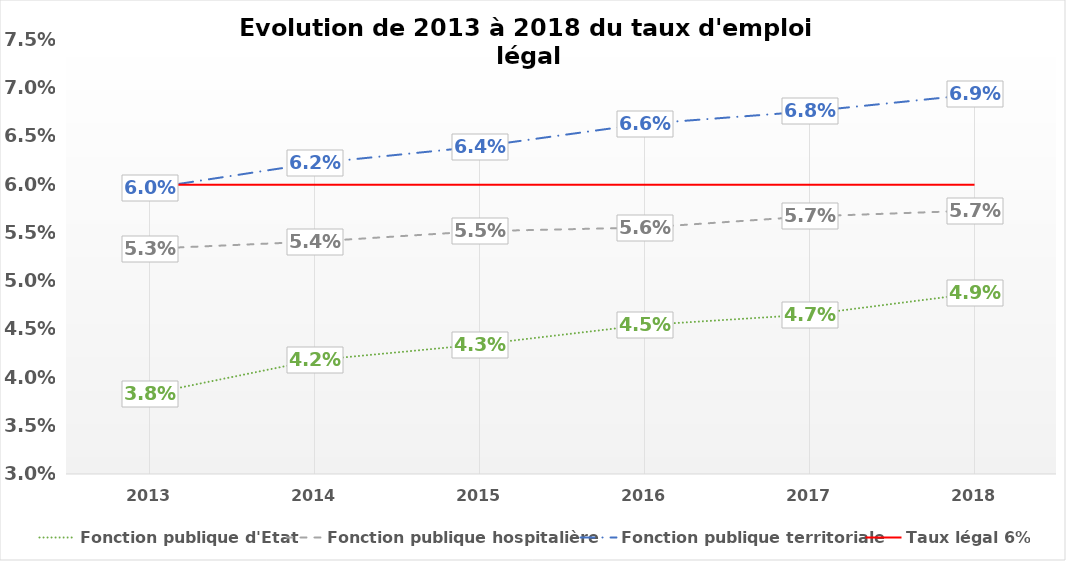
| Category | Fonction publique d'Etat | Fonction publique hospitalière | Fonction publique territoriale | Taux légal 6% |
|---|---|---|---|---|
| 2013.0 | 0.038 | 0.053 | 0.06 | 0.06 |
| 2014.0 | 0.042 | 0.054 | 0.062 | 0.06 |
| 2015.0 | 0.043 | 0.055 | 0.064 | 0.06 |
| 2016.0 | 0.045 | 0.056 | 0.066 | 0.06 |
| 2017.0 | 0.047 | 0.057 | 0.068 | 0.06 |
| 2018.0 | 0.049 | 0.057 | 0.069 | 0.06 |